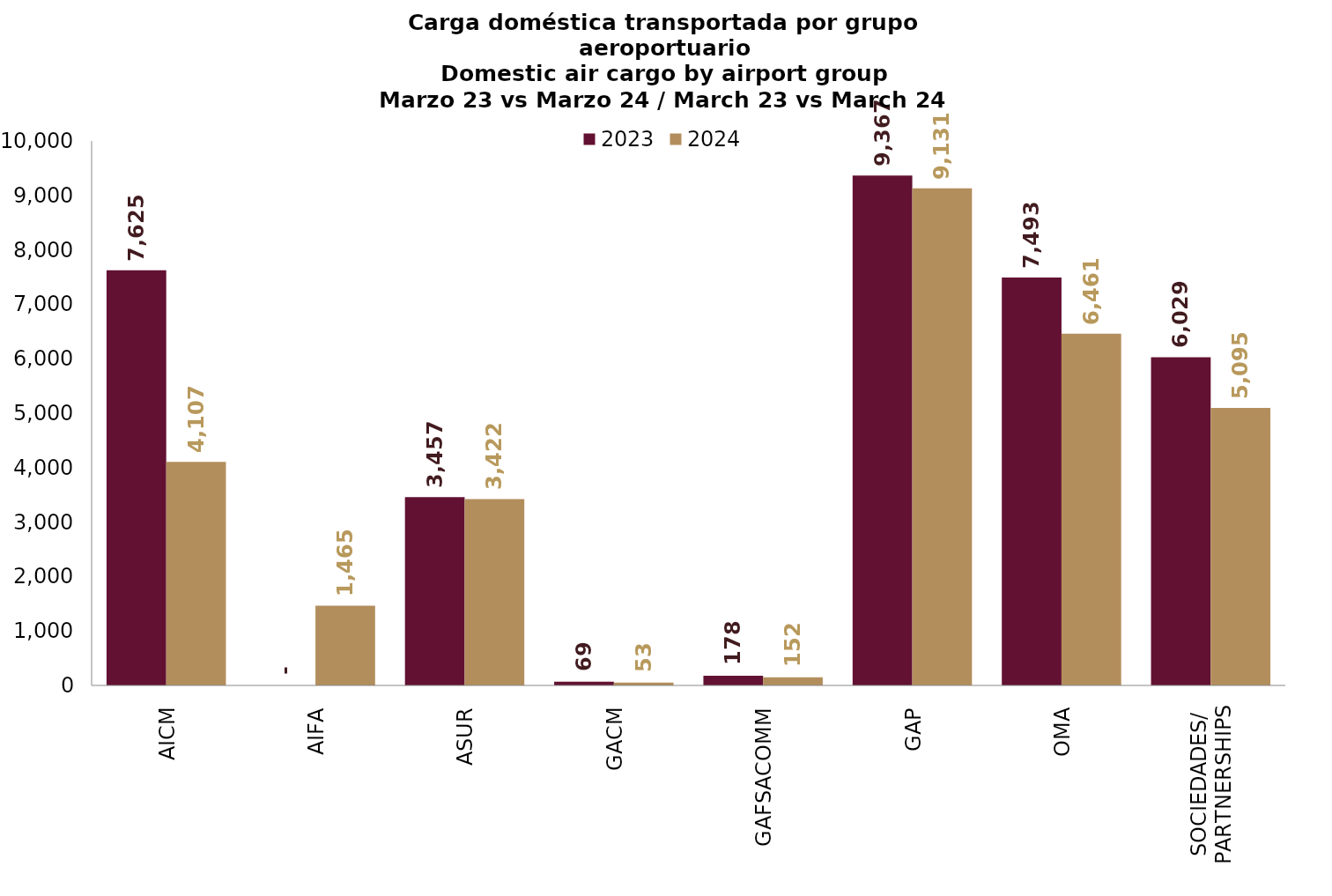
| Category | 2023 | 2024 |
|---|---|---|
| AICM | 7624.96 | 4107.3 |
| AIFA | 0 | 1465.432 |
| ASUR | 3457.035 | 3422.356 |
| GACM | 68.709 | 53.191 |
| GAFSACOMM | 178.404 | 151.697 |
| GAP | 9366.539 | 9131.125 |
| OMA | 7493.317 | 6461.394 |
| SOCIEDADES/
PARTNERSHIPS | 6028.645 | 5095.329 |